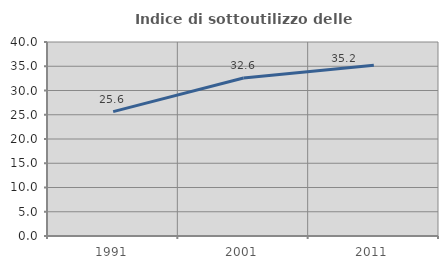
| Category | Indice di sottoutilizzo delle abitazioni  |
|---|---|
| 1991.0 | 25.649 |
| 2001.0 | 32.586 |
| 2011.0 | 35.209 |